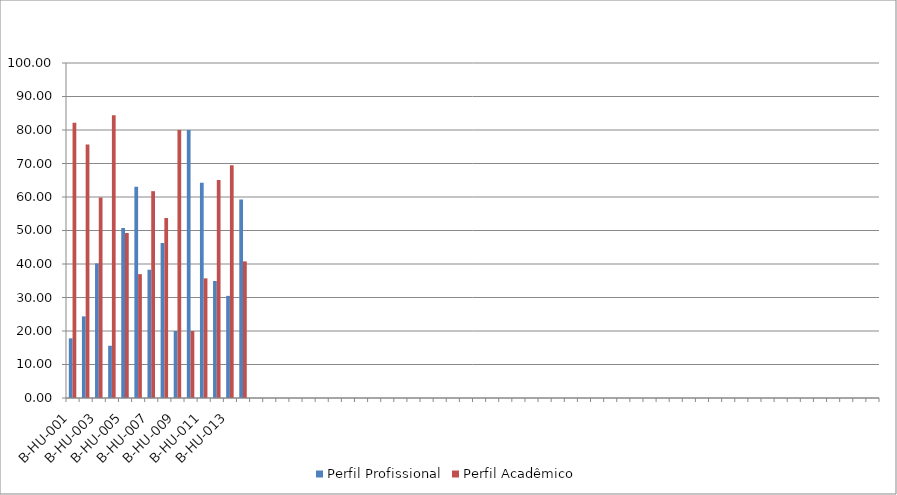
| Category | Perfil Profissional | Perfil Acadêmico |
|---|---|---|
| B-HU-001 | 17.808 | 82.192 |
| B-HU-002 | 24.365 | 75.635 |
| B-HU-003 | 40.171 | 59.829 |
| B-HU-004 | 15.596 | 84.404 |
| B-HU-005 | 50.735 | 49.265 |
| B-HU-006 | 63.023 | 36.977 |
| B-HU-007 | 38.255 | 61.745 |
| B-HU-008 | 46.237 | 53.763 |
| B-HU-009 | 20 | 80 |
| B-HU-010 | 80 | 20 |
| B-HU-011 | 64.286 | 35.714 |
| B-HU-012 | 34.932 | 65.068 |
| B-HU-013 | 30.488 | 69.512 |
| B-HU-014 | 59.223 | 40.777 |